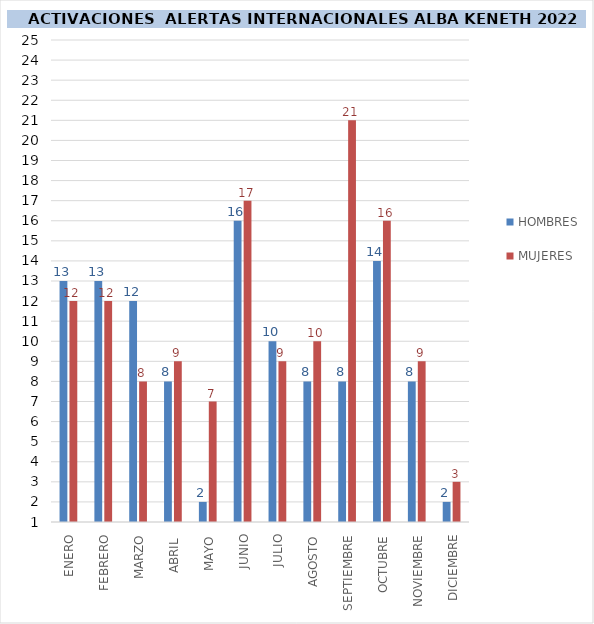
| Category | HOMBRES | MUJERES |
|---|---|---|
| ENERO | 13 | 12 |
| FEBRERO | 13 | 12 |
| MARZO | 12 | 8 |
| ABRIL  | 8 | 9 |
| MAYO | 2 | 7 |
| JUNIO | 16 | 17 |
| JULIO | 10 | 9 |
| AGOSTO | 8 | 10 |
| SEPTIEMBRE | 8 | 21 |
| OCTUBRE | 14 | 16 |
| NOVIEMBRE | 8 | 9 |
| DICIEMBRE | 2 | 3 |